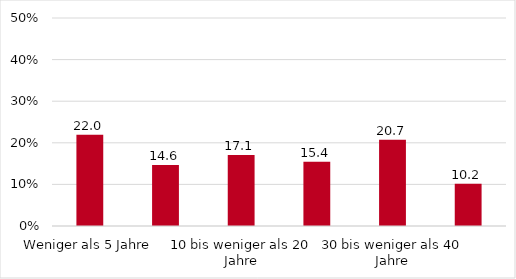
| Category | Series 0 |
|---|---|
| Weniger als 5 Jahre | 21.951 |
| 5 bis weniger als 10 Jahre | 14.634 |
| 10 bis weniger als 20 Jahre | 17.073 |
| 20 bis weniger als 30 Jahre | 15.447 |
| 30 bis weniger als 40 Jahre | 20.732 |
| 40 Jahre und mehr | 10.163 |